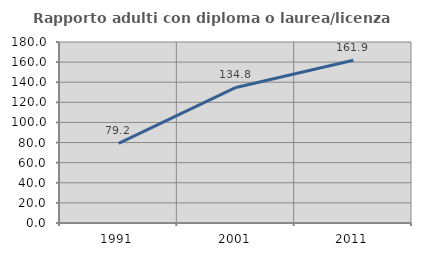
| Category | Rapporto adulti con diploma o laurea/licenza media  |
|---|---|
| 1991.0 | 79.167 |
| 2001.0 | 134.783 |
| 2011.0 | 161.905 |